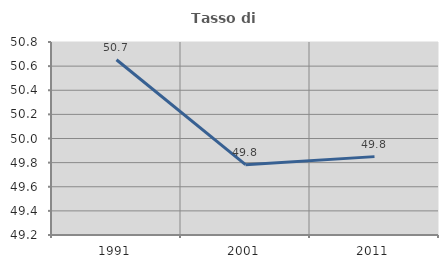
| Category | Tasso di occupazione   |
|---|---|
| 1991.0 | 50.653 |
| 2001.0 | 49.783 |
| 2011.0 | 49.85 |